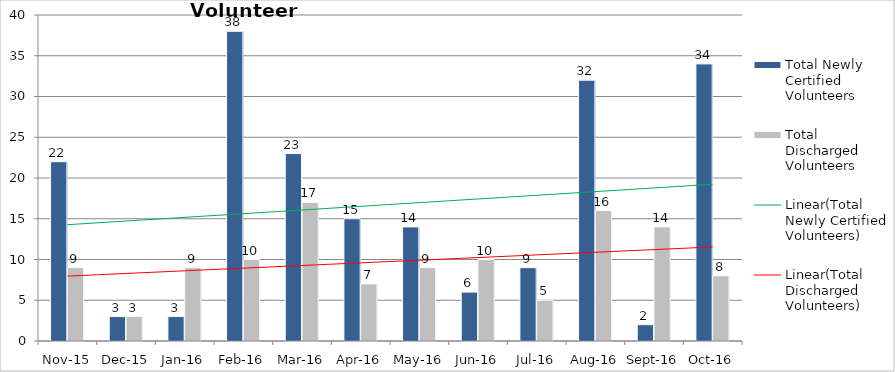
| Category | Total Newly Certified Volunteers | Total Discharged Volunteers |
|---|---|---|
| Nov-15 | 22 | 9 |
| Dec-15 | 3 | 3 |
| Jan-16 | 3 | 9 |
| Feb-16 | 38 | 10 |
| Mar-16 | 23 | 17 |
| Apr-16 | 15 | 7 |
| May-16 | 14 | 9 |
| Jun-16 | 6 | 10 |
| Jul-16 | 9 | 5 |
| Aug-16 | 32 | 16 |
| Sep-16 | 2 | 14 |
| Oct-16 | 34 | 8 |